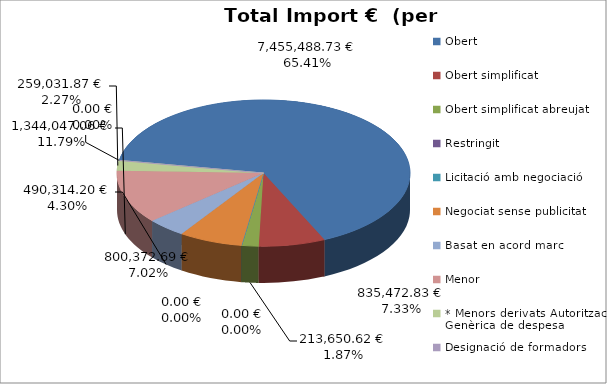
| Category | Total preu              (amb iva) |
|---|---|
| Obert | 7455488.73 |
| Obert simplificat | 835472.83 |
| Obert simplificat abreujat | 213650.62 |
| Restringit | 0 |
| Licitació amb negociació | 0 |
| Negociat sense publicitat | 800372.69 |
| Basat en acord marc | 490314.2 |
| Menor | 1344047.06 |
| * Menors derivats Autorització Genèrica de despesa | 259031.87 |
| Designació de formadors | 0 |